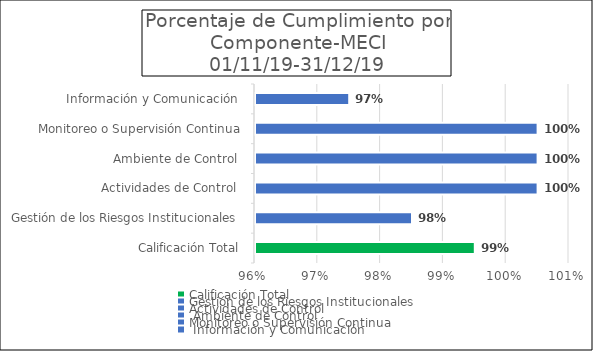
| Category | Series 0 |
|---|---|
| Calificación Total | 0.99 |
| Gestión de los Riesgos Institucionales  | 0.98 |
| Actividades de Control  | 1 |
|  Ambiente de Control  | 1 |
| Monitoreo o Supervisión Continua | 1 |
|  Información y Comunicación  | 0.97 |